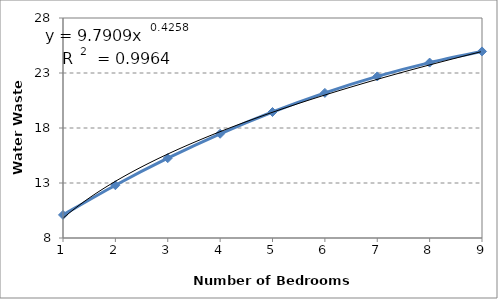
| Category | Series 0 |
|---|---|
| 1.0 | 10.099 |
| 2.0 | 12.798 |
| 3.0 | 15.257 |
| 4.0 | 17.476 |
| 5.0 | 19.454 |
| 6.0 | 21.192 |
| 7.0 | 22.689 |
| 8.0 | 23.946 |
| 9.0 | 24.962 |